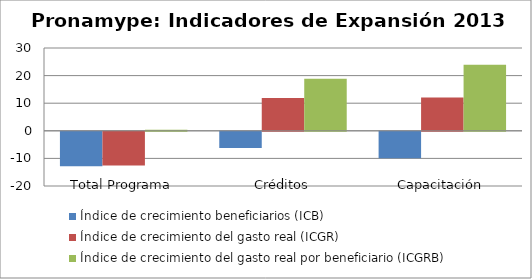
| Category | Índice de crecimiento beneficiarios (ICB)  | Índice de crecimiento del gasto real (ICGR)  | Índice de crecimiento del gasto real por beneficiario (ICGRB)  |
|---|---|---|---|
| Total Programa | -12.503 | -12.169 | 0.382 |
| Créditos | -5.882 | 11.876 | 18.868 |
| Capacitación | -9.599 | 12.069 | 23.969 |